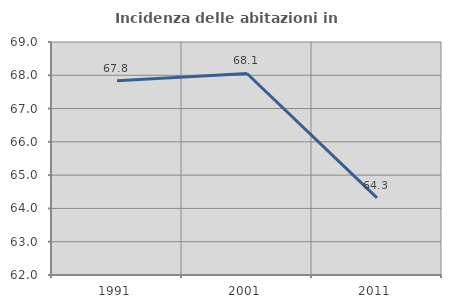
| Category | Incidenza delle abitazioni in proprietà  |
|---|---|
| 1991.0 | 67.839 |
| 2001.0 | 68.054 |
| 2011.0 | 64.319 |